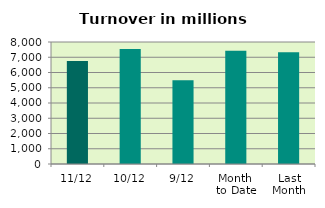
| Category | Series 0 |
|---|---|
| 11/12 | 6746.051 |
| 10/12 | 7539.699 |
| 9/12 | 5492.525 |
| Month 
to Date | 7431.606 |
| Last
Month | 7326.344 |